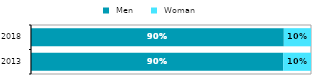
| Category |  Men |  Woman |
|---|---|---|
| 2013.0 | 0.901 | 0.099 |
| 2018.0 | 0.903 | 0.097 |